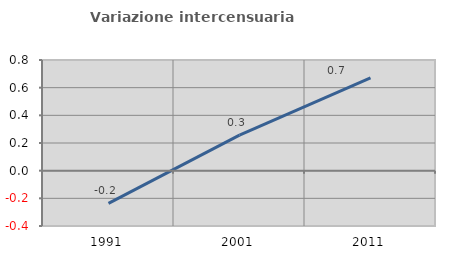
| Category | Variazione intercensuaria annua |
|---|---|
| 1991.0 | -0.237 |
| 2001.0 | 0.257 |
| 2011.0 | 0.671 |